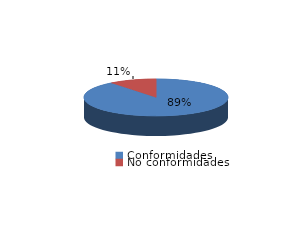
| Category | Series 0 |
|---|---|
| Conformidades | 277 |
| No conformidades | 33 |